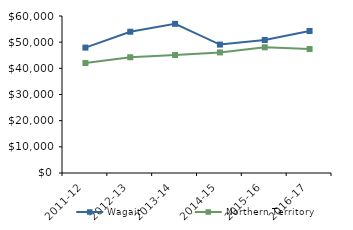
| Category | Wagait | Northern Territory |
|---|---|---|
| 2011-12 | 47918.02 | 42021 |
| 2012-13 | 53978.87 | 44232.02 |
| 2013-14 | 57005.42 | 45075.51 |
| 2014-15 | 49077 | 46083.65 |
| 2015-16 | 50818 | 48046.27 |
| 2016-17 | 54263.33 | 47367.05 |